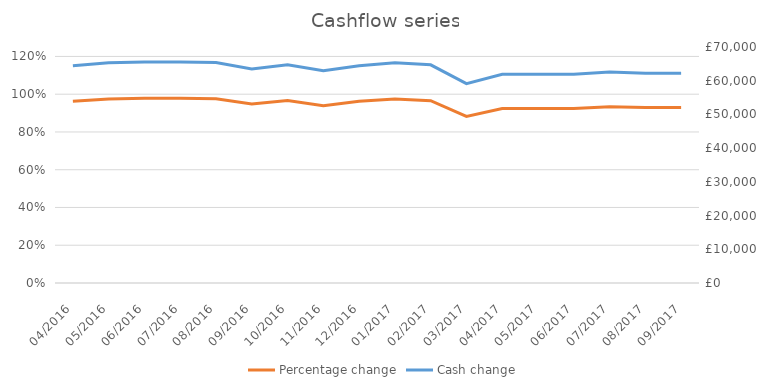
| Category | Percentage change |
|---|---|
| 2016-04-01 | 0.962 |
| 2016-05-01 | 0.975 |
| 2016-06-01 | 0.978 |
| 2016-07-01 | 0.978 |
| 2016-08-01 | 0.976 |
| 2016-09-01 | 0.948 |
| 2016-10-01 | 0.967 |
| 2016-11-01 | 0.939 |
| 2016-12-01 | 0.962 |
| 2017-01-01 | 0.975 |
| 2017-02-01 | 0.966 |
| 2017-03-01 | 0.883 |
| 2017-04-01 | 0.924 |
| 2017-05-01 | 0.924 |
| 2017-06-01 | 0.924 |
| 2017-07-01 | 0.934 |
| 2017-08-01 | 0.929 |
| 2017-09-01 | 0.929 |